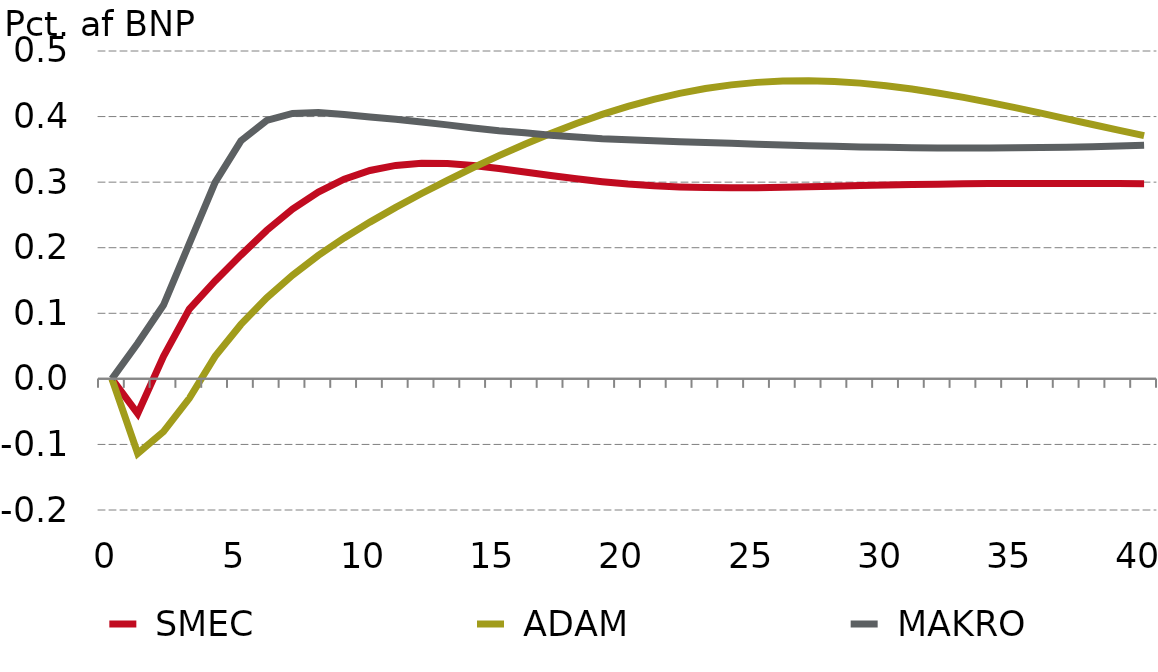
| Category |  SMEC |  ADAM |  MAKRO |
|---|---|---|---|
| 0.0 | 0 | 0 | 0 |
| nan | -0.053 | -0.114 | 0.054 |
| nan | 0.034 | -0.08 | 0.113 |
| nan | 0.106 | -0.03 | 0.206 |
| nan | 0.149 | 0.034 | 0.3 |
| 5.0 | 0.189 | 0.083 | 0.363 |
| nan | 0.226 | 0.124 | 0.394 |
| nan | 0.259 | 0.158 | 0.405 |
| nan | 0.285 | 0.188 | 0.406 |
| nan | 0.304 | 0.215 | 0.403 |
| 10.0 | 0.318 | 0.239 | 0.399 |
| nan | 0.326 | 0.262 | 0.396 |
| nan | 0.329 | 0.283 | 0.392 |
| nan | 0.328 | 0.303 | 0.387 |
| nan | 0.325 | 0.322 | 0.383 |
| 15.0 | 0.321 | 0.34 | 0.378 |
| nan | 0.316 | 0.358 | 0.375 |
| nan | 0.31 | 0.374 | 0.372 |
| nan | 0.305 | 0.389 | 0.369 |
| nan | 0.301 | 0.403 | 0.366 |
| 20.0 | 0.297 | 0.416 | 0.365 |
| nan | 0.294 | 0.426 | 0.363 |
| nan | 0.293 | 0.435 | 0.362 |
| nan | 0.292 | 0.443 | 0.36 |
| nan | 0.291 | 0.448 | 0.359 |
| 25.0 | 0.292 | 0.452 | 0.358 |
| nan | 0.292 | 0.454 | 0.357 |
| nan | 0.293 | 0.455 | 0.355 |
| nan | 0.294 | 0.454 | 0.355 |
| nan | 0.295 | 0.451 | 0.354 |
| 30.0 | 0.296 | 0.447 | 0.353 |
| nan | 0.296 | 0.442 | 0.352 |
| nan | 0.297 | 0.436 | 0.352 |
| nan | 0.297 | 0.429 | 0.352 |
| nan | 0.298 | 0.422 | 0.352 |
| 35.0 | 0.298 | 0.414 | 0.352 |
| nan | 0.298 | 0.405 | 0.353 |
| nan | 0.298 | 0.397 | 0.353 |
| nan | 0.298 | 0.388 | 0.354 |
| nan | 0.298 | 0.379 | 0.355 |
| 40.0 | 0.298 | 0.371 | 0.356 |